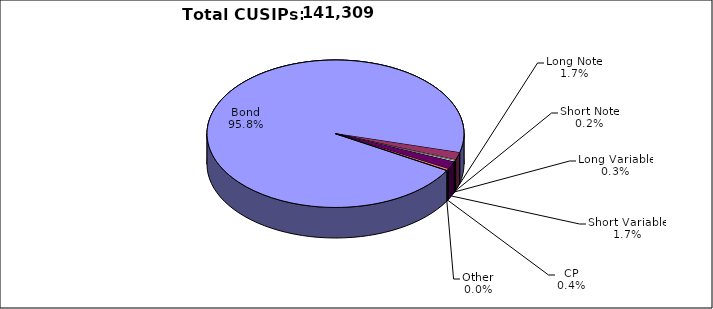
| Category | CUSIPs |
|---|---|
| Bond | 135388 |
| Long Note | 2334 |
| Short Note | 284 |
| Long Variable | 354 |
| Short Variable | 2348 |
| CP | 545 |
| Other | 56 |